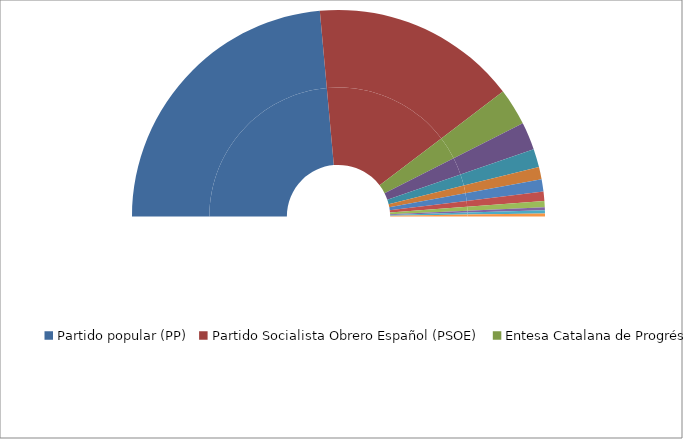
| Category | Series 0 | Series 1 |
|---|---|---|
| Partido popular (PP) | 98 | 47.115 |
| Partido Socialista Obrero Español (PSOE) | 67 | 32.212 |
| Entesa Catalana de Progrés | 12 | 5.769 |
| Partido Socialista de Euskadi-Euskadiko Ezkerra (PSOE) | 9 | 4.327 |
| Partido Socialista Obreto Español de Andalucía | 6 | 2.885 |
| Convergencia i Unió | 4 | 1.923 |
| Partido Dos Socialistas de Galicia-PSOE | 4 | 1.923 |
| Unión del Pueblo Navarro en coalición con Partido Popular | 3 | 1.442 |
| Eusko Alderdi Jetzalea-Partido Nacionalista Vasco | 2 | 0.962 |
| Agrupación Herreña Independiente-Coalición Canaria | 1 | 0.481 |
| Eivissa i Formentera al Senat | 1 | 0.481 |
| PSOE-EU-PSM-VERDS | 1 | 0.481 |